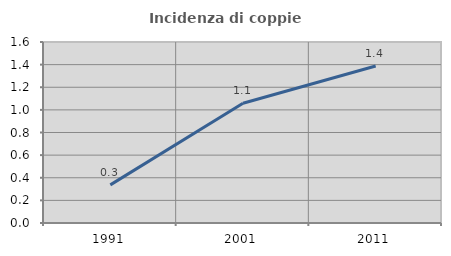
| Category | Incidenza di coppie miste |
|---|---|
| 1991.0 | 0.337 |
| 2001.0 | 1.058 |
| 2011.0 | 1.388 |